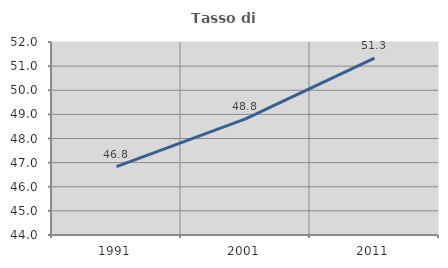
| Category | Tasso di occupazione   |
|---|---|
| 1991.0 | 46.834 |
| 2001.0 | 48.817 |
| 2011.0 | 51.333 |